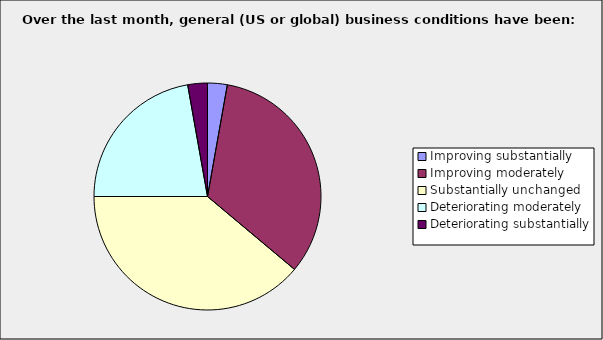
| Category | Series 0 |
|---|---|
| Improving substantially | 0.028 |
| Improving moderately | 0.333 |
| Substantially unchanged | 0.389 |
| Deteriorating moderately | 0.222 |
| Deteriorating substantially | 0.028 |